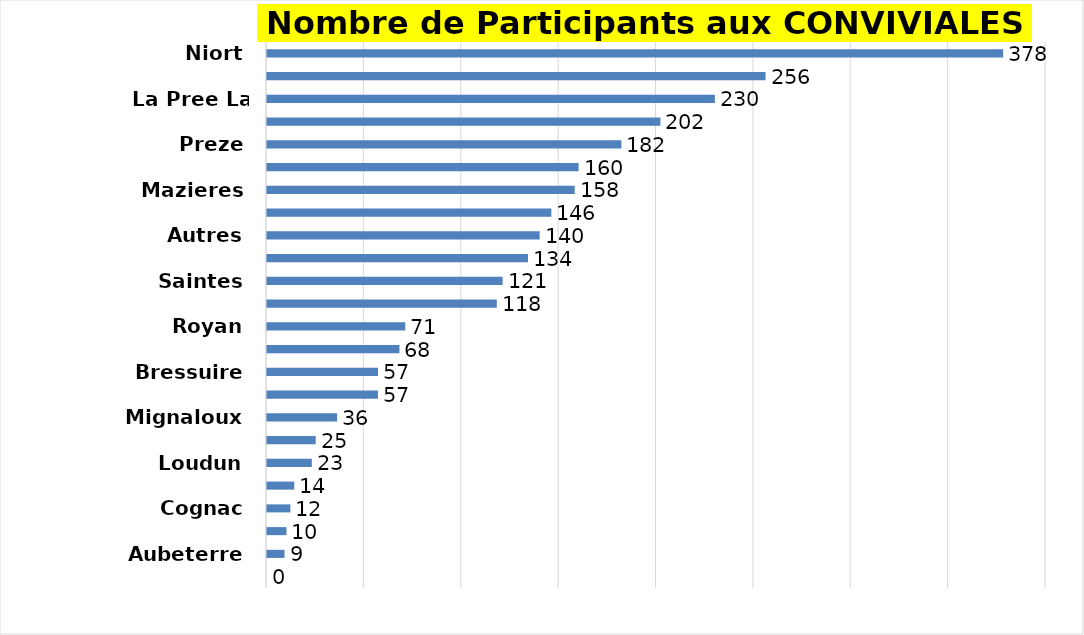
| Category | Series 0 |
|---|---|
| Niort | 378 |
| La Palmyre | 256 |
| La Pree La Rochelle | 230 |
| Angouleme Hiron | 202 |
| Preze | 182 |
| Haut Poitou | 160 |
| Mazieres | 158 |
| Ch. Vallade | 146 |
| Autres | 140 |
| Rochelle Sud | 134 |
| Saintes | 121 |
| Rochefort Ocean | 118 |
| Royan | 71 |
| Montendre | 68 |
| Bressuire | 57 |
| Roche Posay | 57 |
| Mignaloux | 36 |
| Poitiers-Chalons | 25 |
| Loudun | 23 |
| Les Forges | 14 |
| Cognac | 12 |
| Oleron | 10 |
| Aubeterre | 9 |
| La Domangere | 0 |